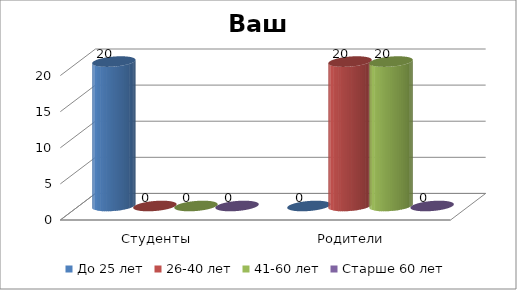
| Category | До 25 лет | 26-40 лет | 41-60 лет | Старше 60 лет |
|---|---|---|---|---|
| Студенты | 20 | 0 | 0 | 0 |
| Родители | 0 | 20 | 20 | 0 |